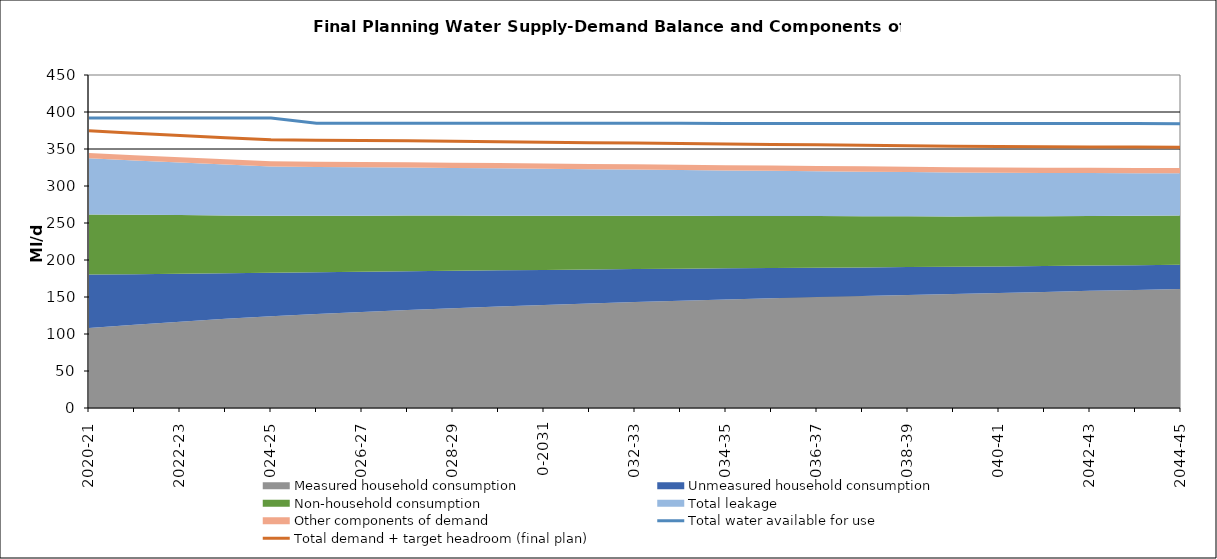
| Category | Total water available for use | Total demand + target headroom (final plan) |
|---|---|---|
| 0 | 392.04 | 374.771 |
| 1 | 392.01 | 371.413 |
| 2 | 391.97 | 368.397 |
| 3 | 391.94 | 365.327 |
| 4 | 391.9 | 362.358 |
| 5 | 384.9 | 361.74 |
| 6 | 384.87 | 361.394 |
| 7 | 384.83 | 360.995 |
| 8 | 384.8 | 360.401 |
| 9 | 384.77 | 359.759 |
| 10 | 384.73 | 359.138 |
| 11 | 384.7 | 358.525 |
| 12 | 384.67 | 357.986 |
| 13 | 384.63 | 357.388 |
| 14 | 384.6 | 356.736 |
| 15 | 384.57 | 356.093 |
| 16 | 384.53 | 355.582 |
| 17 | 384.5 | 354.933 |
| 18 | 384.46 | 354.266 |
| 19 | 384.43 | 353.596 |
| 20 | 384.4 | 353.272 |
| 21 | 384.36 | 352.989 |
| 22 | 384.33 | 352.868 |
| 23 | 384.3 | 352.632 |
| 24 | 384.26 | 352.47 |